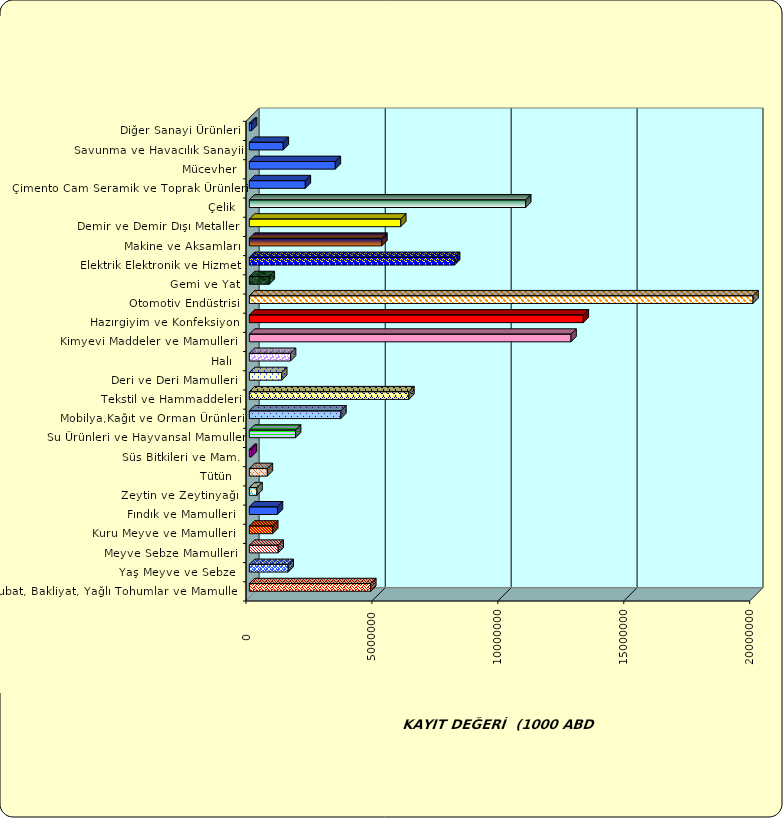
| Category | Series 0 |
|---|---|
|  Hububat, Bakliyat, Yağlı Tohumlar ve Mamulleri  | 4821291.905 |
|  Yaş Meyve ve Sebze   | 1542610.45 |
|  Meyve Sebze Mamulleri  | 1145284.496 |
|  Kuru Meyve ve Mamulleri   | 927164.563 |
|  Fındık ve Mamulleri  | 1116088.11 |
|  Zeytin ve Zeytinyağı  | 303287.339 |
|  Tütün  | 716133.544 |
|  Süs Bitkileri ve Mam. | 79404.16 |
|  Su Ürünleri ve Hayvansal Mamuller | 1835266.062 |
|  Mobilya,Kağıt ve Orman Ürünleri | 3634314.192 |
|  Tekstil ve Hammaddeleri | 6335451.577 |
|  Deri ve Deri Mamulleri  | 1284302.085 |
|  Halı  | 1635551.335 |
|  Kimyevi Maddeler ve Mamulleri   | 12772718.858 |
|  Hazırgiyim ve Konfeksiyon  | 13261425.367 |
|  Otomotiv Endüstrisi | 23414752.309 |
|  Gemi ve Yat | 791879.665 |
|  Elektrik Elektronik ve Hizmet | 8150016.093 |
|  Makine ve Aksamları | 5262283.658 |
|  Demir ve Demir Dışı Metaller  | 6012183.588 |
|  Çelik | 10972830.072 |
|  Çimento Cam Seramik ve Toprak Ürünleri | 2223186.12 |
|  Mücevher | 3413720.423 |
|  Savunma ve Havacılık Sanayii | 1347580.127 |
|  Diğer Sanayi Ürünleri | 86632.568 |